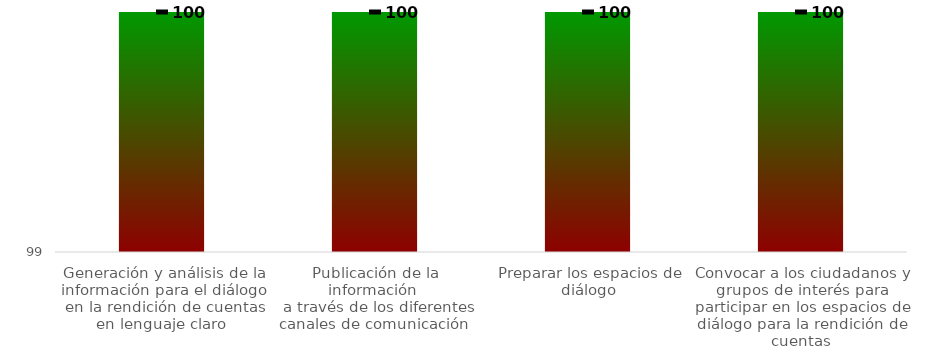
| Category | Rangos |
|---|---|
| Generación y análisis de la información para el diálogo en la rendición de cuentas en lenguaje claro  | 100 |
| Publicación de la información 
 a través de los diferentes canales de comunicación  | 100 |
| Preparar los espacios de diálogo | 100 |
| Convocar a los ciudadanos y grupos de interés para participar en los espacios de diálogo para la rendición de cuentas | 100 |